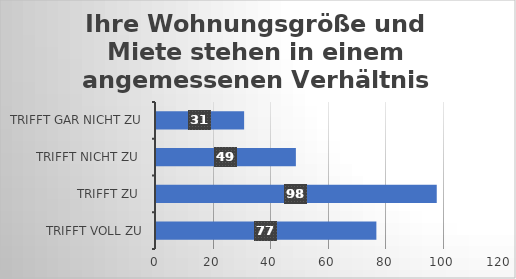
| Category | Ihre Wohnungsgröße und Miete stehen in einem angemessenen Verhältnis zueinander.  |
|---|---|
| trifft voll zu | 77 |
| trifft zu  | 98 |
| trifft nicht zu  | 49 |
| trifft gar nicht zu | 31 |